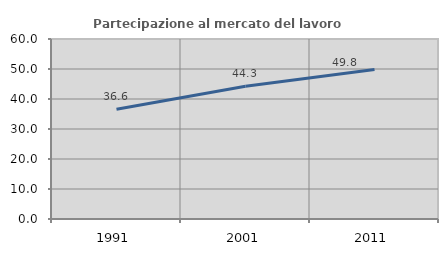
| Category | Partecipazione al mercato del lavoro  femminile |
|---|---|
| 1991.0 | 36.595 |
| 2001.0 | 44.276 |
| 2011.0 | 49.844 |